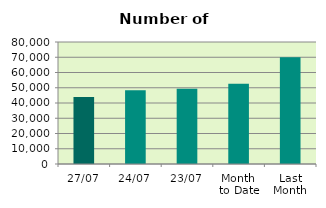
| Category | Series 0 |
|---|---|
| 27/07 | 43864 |
| 24/07 | 48408 |
| 23/07 | 49382 |
| Month 
to Date | 52689.789 |
| Last
Month | 70062.455 |